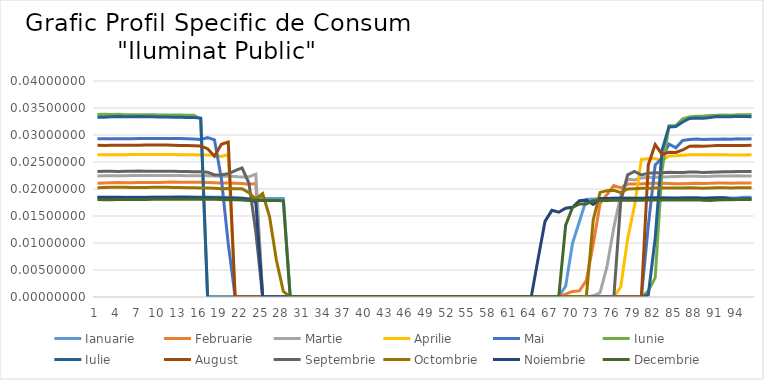
| Category | Ianuarie | Februarie | Martie | Aprilie | Mai | Iunie | Iulie | August | Septembrie | Octombrie | Noiembrie | Decembrie |
|---|---|---|---|---|---|---|---|---|---|---|---|---|
| 0 | 0.019 | 0.021 | 0.022 | 0.026 | 0.029 | 0.034 | 0.033 | 0.028 | 0.023 | 0.02 | 0.018 | 0.018 |
| 1 | 0.019 | 0.021 | 0.022 | 0.026 | 0.029 | 0.034 | 0.033 | 0.028 | 0.023 | 0.02 | 0.018 | 0.018 |
| 2 | 0.019 | 0.021 | 0.022 | 0.026 | 0.029 | 0.034 | 0.033 | 0.028 | 0.023 | 0.02 | 0.018 | 0.018 |
| 3 | 0.019 | 0.021 | 0.022 | 0.026 | 0.029 | 0.034 | 0.033 | 0.028 | 0.023 | 0.02 | 0.018 | 0.018 |
| 4 | 0.018 | 0.021 | 0.022 | 0.026 | 0.029 | 0.034 | 0.033 | 0.028 | 0.023 | 0.02 | 0.018 | 0.018 |
| 5 | 0.018 | 0.021 | 0.022 | 0.026 | 0.029 | 0.034 | 0.033 | 0.028 | 0.023 | 0.02 | 0.018 | 0.018 |
| 6 | 0.018 | 0.021 | 0.023 | 0.026 | 0.029 | 0.034 | 0.033 | 0.028 | 0.023 | 0.02 | 0.018 | 0.018 |
| 7 | 0.018 | 0.021 | 0.023 | 0.026 | 0.029 | 0.034 | 0.033 | 0.028 | 0.023 | 0.02 | 0.018 | 0.018 |
| 8 | 0.018 | 0.021 | 0.022 | 0.026 | 0.029 | 0.034 | 0.033 | 0.028 | 0.023 | 0.02 | 0.018 | 0.018 |
| 9 | 0.018 | 0.021 | 0.023 | 0.026 | 0.029 | 0.034 | 0.033 | 0.028 | 0.023 | 0.02 | 0.018 | 0.018 |
| 10 | 0.018 | 0.021 | 0.023 | 0.026 | 0.029 | 0.034 | 0.033 | 0.028 | 0.023 | 0.02 | 0.018 | 0.018 |
| 11 | 0.018 | 0.021 | 0.022 | 0.026 | 0.029 | 0.034 | 0.033 | 0.028 | 0.023 | 0.02 | 0.018 | 0.018 |
| 12 | 0.019 | 0.021 | 0.022 | 0.026 | 0.029 | 0.034 | 0.033 | 0.028 | 0.023 | 0.02 | 0.018 | 0.018 |
| 13 | 0.019 | 0.021 | 0.022 | 0.026 | 0.029 | 0.034 | 0.033 | 0.028 | 0.023 | 0.02 | 0.018 | 0.018 |
| 14 | 0.019 | 0.021 | 0.022 | 0.026 | 0.029 | 0.034 | 0.033 | 0.028 | 0.023 | 0.02 | 0.018 | 0.018 |
| 15 | 0.019 | 0.021 | 0.022 | 0.026 | 0.029 | 0.033 | 0.033 | 0.028 | 0.023 | 0.02 | 0.018 | 0.018 |
| 16 | 0.018 | 0.021 | 0.022 | 0.026 | 0.03 | 0 | 0 | 0.027 | 0.023 | 0.02 | 0.018 | 0.018 |
| 17 | 0.018 | 0.021 | 0.022 | 0.026 | 0.029 | 0 | 0 | 0.026 | 0.023 | 0.02 | 0.018 | 0.018 |
| 18 | 0.018 | 0.021 | 0.022 | 0.026 | 0.022 | 0 | 0 | 0.028 | 0.023 | 0.02 | 0.018 | 0.018 |
| 19 | 0.018 | 0.021 | 0.022 | 0.026 | 0.01 | 0 | 0 | 0.029 | 0.023 | 0.02 | 0.018 | 0.018 |
| 20 | 0.018 | 0.021 | 0.022 | 0 | 0 | 0 | 0 | 0 | 0.023 | 0.02 | 0.018 | 0.018 |
| 21 | 0.018 | 0.021 | 0.022 | 0 | 0 | 0 | 0 | 0 | 0.024 | 0.02 | 0.018 | 0.018 |
| 22 | 0.018 | 0.021 | 0.022 | 0 | 0 | 0 | 0 | 0 | 0.021 | 0.019 | 0.018 | 0.018 |
| 23 | 0.018 | 0.021 | 0.023 | 0 | 0 | 0 | 0 | 0 | 0.012 | 0.018 | 0.018 | 0.018 |
| 24 | 0.018 | 0 | 0 | 0 | 0 | 0 | 0 | 0 | 0 | 0.019 | 0 | 0.018 |
| 25 | 0.018 | 0 | 0 | 0 | 0 | 0 | 0 | 0 | 0 | 0.015 | 0 | 0.018 |
| 26 | 0.018 | 0 | 0 | 0 | 0 | 0 | 0 | 0 | 0 | 0.007 | 0 | 0.018 |
| 27 | 0.018 | 0 | 0 | 0 | 0 | 0 | 0 | 0 | 0 | 0.001 | 0 | 0.018 |
| 28 | 0 | 0 | 0 | 0 | 0 | 0 | 0 | 0 | 0 | 0 | 0 | 0 |
| 29 | 0 | 0 | 0 | 0 | 0 | 0 | 0 | 0 | 0 | 0 | 0 | 0 |
| 30 | 0 | 0 | 0 | 0 | 0 | 0 | 0 | 0 | 0 | 0 | 0 | 0 |
| 31 | 0 | 0 | 0 | 0 | 0 | 0 | 0 | 0 | 0 | 0 | 0 | 0 |
| 32 | 0 | 0 | 0 | 0 | 0 | 0 | 0 | 0 | 0 | 0 | 0 | 0 |
| 33 | 0 | 0 | 0 | 0 | 0 | 0 | 0 | 0 | 0 | 0 | 0 | 0 |
| 34 | 0 | 0 | 0 | 0 | 0 | 0 | 0 | 0 | 0 | 0 | 0 | 0 |
| 35 | 0 | 0 | 0 | 0 | 0 | 0 | 0 | 0 | 0 | 0 | 0 | 0 |
| 36 | 0 | 0 | 0 | 0 | 0 | 0 | 0 | 0 | 0 | 0 | 0 | 0 |
| 37 | 0 | 0 | 0 | 0 | 0 | 0 | 0 | 0 | 0 | 0 | 0 | 0 |
| 38 | 0 | 0 | 0 | 0 | 0 | 0 | 0 | 0 | 0 | 0 | 0 | 0 |
| 39 | 0 | 0 | 0 | 0 | 0 | 0 | 0 | 0 | 0 | 0 | 0 | 0 |
| 40 | 0 | 0 | 0 | 0 | 0 | 0 | 0 | 0 | 0 | 0 | 0 | 0 |
| 41 | 0 | 0 | 0 | 0 | 0 | 0 | 0 | 0 | 0 | 0 | 0 | 0 |
| 42 | 0 | 0 | 0 | 0 | 0 | 0 | 0 | 0 | 0 | 0 | 0 | 0 |
| 43 | 0 | 0 | 0 | 0 | 0 | 0 | 0 | 0 | 0 | 0 | 0 | 0 |
| 44 | 0 | 0 | 0 | 0 | 0 | 0 | 0 | 0 | 0 | 0 | 0 | 0 |
| 45 | 0 | 0 | 0 | 0 | 0 | 0 | 0 | 0 | 0 | 0 | 0 | 0 |
| 46 | 0 | 0 | 0 | 0 | 0 | 0 | 0 | 0 | 0 | 0 | 0 | 0 |
| 47 | 0 | 0 | 0 | 0 | 0 | 0 | 0 | 0 | 0 | 0 | 0 | 0 |
| 48 | 0 | 0 | 0 | 0 | 0 | 0 | 0 | 0 | 0 | 0 | 0 | 0 |
| 49 | 0 | 0 | 0 | 0 | 0 | 0 | 0 | 0 | 0 | 0 | 0 | 0 |
| 50 | 0 | 0 | 0 | 0 | 0 | 0 | 0 | 0 | 0 | 0 | 0 | 0 |
| 51 | 0 | 0 | 0 | 0 | 0 | 0 | 0 | 0 | 0 | 0 | 0 | 0 |
| 52 | 0 | 0 | 0 | 0 | 0 | 0 | 0 | 0 | 0 | 0 | 0 | 0 |
| 53 | 0 | 0 | 0 | 0 | 0 | 0 | 0 | 0 | 0 | 0 | 0 | 0 |
| 54 | 0 | 0 | 0 | 0 | 0 | 0 | 0 | 0 | 0 | 0 | 0 | 0 |
| 55 | 0 | 0 | 0 | 0 | 0 | 0 | 0 | 0 | 0 | 0 | 0 | 0 |
| 56 | 0 | 0 | 0 | 0 | 0 | 0 | 0 | 0 | 0 | 0 | 0 | 0 |
| 57 | 0 | 0 | 0 | 0 | 0 | 0 | 0 | 0 | 0 | 0 | 0 | 0 |
| 58 | 0 | 0 | 0 | 0 | 0 | 0 | 0 | 0 | 0 | 0 | 0 | 0 |
| 59 | 0 | 0 | 0 | 0 | 0 | 0 | 0 | 0 | 0 | 0 | 0 | 0 |
| 60 | 0 | 0 | 0 | 0 | 0 | 0 | 0 | 0 | 0 | 0 | 0 | 0 |
| 61 | 0 | 0 | 0 | 0 | 0 | 0 | 0 | 0 | 0 | 0 | 0 | 0 |
| 62 | 0 | 0 | 0 | 0 | 0 | 0 | 0 | 0 | 0 | 0 | 0 | 0 |
| 63 | 0 | 0 | 0 | 0 | 0 | 0 | 0 | 0 | 0 | 0 | 0 | 0 |
| 64 | 0 | 0 | 0 | 0 | 0 | 0 | 0 | 0 | 0 | 0 | 0.007 | 0 |
| 65 | 0 | 0 | 0 | 0 | 0 | 0 | 0 | 0 | 0 | 0 | 0.014 | 0 |
| 66 | 0 | 0 | 0 | 0 | 0 | 0 | 0 | 0 | 0 | 0 | 0.016 | 0 |
| 67 | 0 | 0 | 0 | 0 | 0 | 0 | 0 | 0 | 0 | 0 | 0.016 | 0 |
| 68 | 0.002 | 0.001 | 0 | 0 | 0 | 0 | 0 | 0 | 0 | 0 | 0.016 | 0.013 |
| 69 | 0.01 | 0.001 | 0 | 0 | 0 | 0 | 0 | 0 | 0 | 0 | 0.017 | 0.017 |
| 70 | 0.014 | 0.001 | 0 | 0 | 0 | 0 | 0 | 0 | 0 | 0 | 0.018 | 0.017 |
| 71 | 0.018 | 0.003 | 0 | 0 | 0 | 0 | 0 | 0 | 0 | 0 | 0.018 | 0.017 |
| 72 | 0.018 | 0.01 | 0 | 0 | 0 | 0 | 0 | 0 | 0 | 0.014 | 0.017 | 0.018 |
| 73 | 0.018 | 0.017 | 0.001 | 0 | 0 | 0 | 0 | 0 | 0 | 0.019 | 0.018 | 0.018 |
| 74 | 0.018 | 0.019 | 0.006 | 0 | 0 | 0 | 0 | 0 | 0 | 0.02 | 0.018 | 0.018 |
| 75 | 0.018 | 0.021 | 0.013 | 0 | 0 | 0 | 0 | 0 | 0 | 0.02 | 0.018 | 0.018 |
| 76 | 0.018 | 0.02 | 0.019 | 0.002 | 0 | 0 | 0 | 0 | 0.018 | 0.019 | 0.018 | 0.018 |
| 77 | 0.018 | 0.021 | 0.022 | 0.011 | 0 | 0 | 0 | 0 | 0.023 | 0.02 | 0.018 | 0.018 |
| 78 | 0.018 | 0.021 | 0.022 | 0.017 | 0 | 0 | 0 | 0 | 0.023 | 0.02 | 0.018 | 0.018 |
| 79 | 0.018 | 0.021 | 0.022 | 0.025 | 0 | 0 | 0 | 0 | 0.023 | 0.02 | 0.018 | 0.018 |
| 80 | 0.018 | 0.021 | 0.022 | 0.026 | 0.013 | 0.001 | 0 | 0.024 | 0.023 | 0.02 | 0.018 | 0.018 |
| 81 | 0.018 | 0.021 | 0.022 | 0.026 | 0.024 | 0.004 | 0.011 | 0.028 | 0.023 | 0.02 | 0.018 | 0.018 |
| 82 | 0.018 | 0.021 | 0.022 | 0.025 | 0.026 | 0.023 | 0.027 | 0.026 | 0.023 | 0.02 | 0.018 | 0.018 |
| 83 | 0.018 | 0.021 | 0.022 | 0.026 | 0.028 | 0.032 | 0.031 | 0.027 | 0.023 | 0.02 | 0.018 | 0.018 |
| 84 | 0.018 | 0.021 | 0.022 | 0.026 | 0.028 | 0.032 | 0.032 | 0.027 | 0.023 | 0.02 | 0.018 | 0.018 |
| 85 | 0.018 | 0.021 | 0.022 | 0.026 | 0.029 | 0.033 | 0.032 | 0.027 | 0.023 | 0.02 | 0.018 | 0.018 |
| 86 | 0.018 | 0.021 | 0.022 | 0.026 | 0.029 | 0.033 | 0.033 | 0.028 | 0.023 | 0.02 | 0.018 | 0.018 |
| 87 | 0.018 | 0.021 | 0.022 | 0.026 | 0.029 | 0.033 | 0.033 | 0.028 | 0.023 | 0.02 | 0.018 | 0.018 |
| 88 | 0.018 | 0.021 | 0.022 | 0.026 | 0.029 | 0.034 | 0.033 | 0.028 | 0.023 | 0.02 | 0.018 | 0.018 |
| 89 | 0.018 | 0.021 | 0.022 | 0.026 | 0.029 | 0.034 | 0.033 | 0.028 | 0.023 | 0.02 | 0.018 | 0.018 |
| 90 | 0.018 | 0.021 | 0.022 | 0.026 | 0.029 | 0.034 | 0.033 | 0.028 | 0.023 | 0.02 | 0.018 | 0.018 |
| 91 | 0.018 | 0.021 | 0.022 | 0.026 | 0.029 | 0.034 | 0.033 | 0.028 | 0.023 | 0.02 | 0.018 | 0.018 |
| 92 | 0.018 | 0.021 | 0.022 | 0.026 | 0.029 | 0.034 | 0.033 | 0.028 | 0.023 | 0.02 | 0.018 | 0.018 |
| 93 | 0.018 | 0.021 | 0.022 | 0.026 | 0.029 | 0.034 | 0.033 | 0.028 | 0.023 | 0.02 | 0.018 | 0.018 |
| 94 | 0.018 | 0.021 | 0.022 | 0.026 | 0.029 | 0.034 | 0.033 | 0.028 | 0.023 | 0.02 | 0.018 | 0.018 |
| 95 | 0.018 | 0.021 | 0.022 | 0.026 | 0.029 | 0.034 | 0.033 | 0.028 | 0.023 | 0.02 | 0.018 | 0.018 |